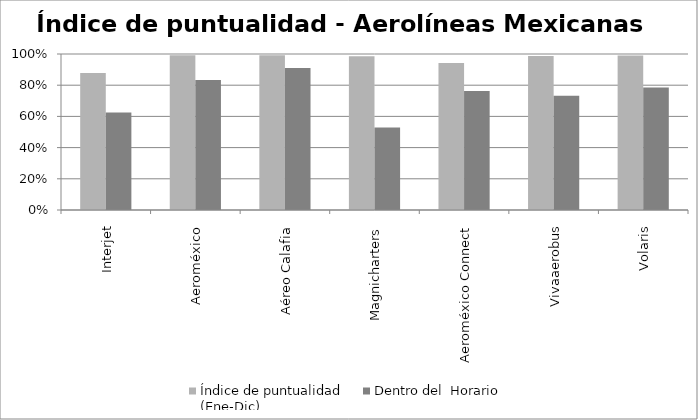
| Category | Índice de puntualidad
(Ene-Dic) | Dentro del  Horario |
|---|---|---|
| Interjet | 0.878 | 0.625 |
| Aeroméxico | 0.993 | 0.833 |
| Aéreo Calafia | 0.991 | 0.91 |
| Magnicharters | 0.986 | 0.529 |
| Aeroméxico Connect | 0.943 | 0.762 |
| Vivaaerobus | 0.988 | 0.732 |
| Volaris | 0.99 | 0.786 |